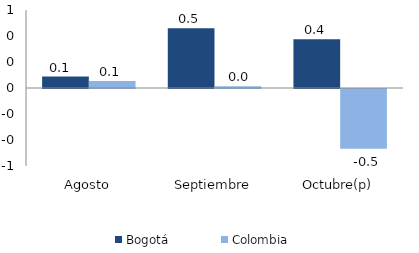
| Category | Bogotá | Colombia |
|---|---|---|
| Agosto | 0.088 | 0.055 |
| Septiembre | 0.459 | 0.013 |
| Octubre(p) | 0.376 | -0.459 |